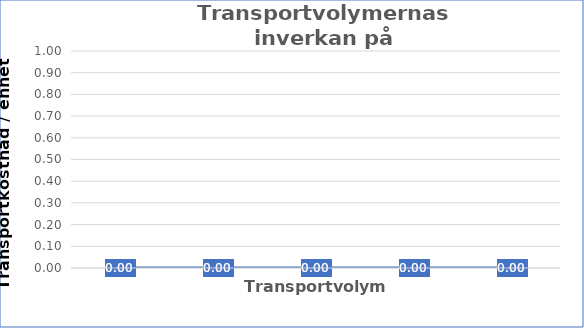
| Category | Series 0 |
|---|---|
|  | 0 |
|  | 0 |
|  | 0 |
|  | 0 |
|  | 0 |